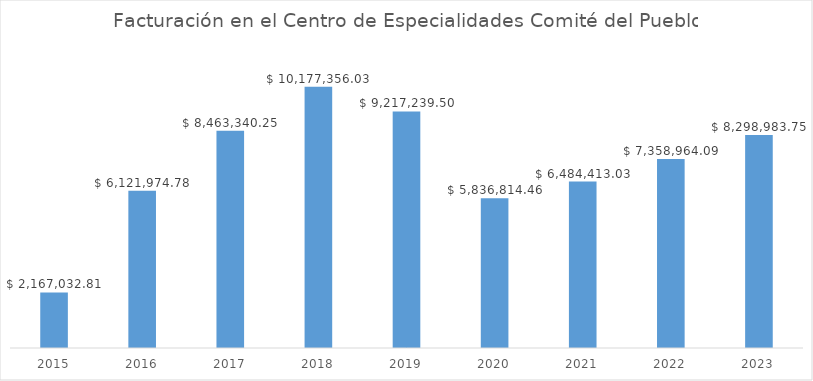
| Category | Valor facturado |
|---|---|
| 2015.0 | 2167032.81 |
| 2016.0 | 6121974.78 |
| 2017.0 | 8463340.25 |
| 2018.0 | 10177356.03 |
| 2019.0 | 9217239.5 |
| 2020.0 | 5836814.46 |
| 2021.0 | 6484413.03 |
| 2022.0 | 7358964.09 |
| 2023.0 | 8298983.75 |